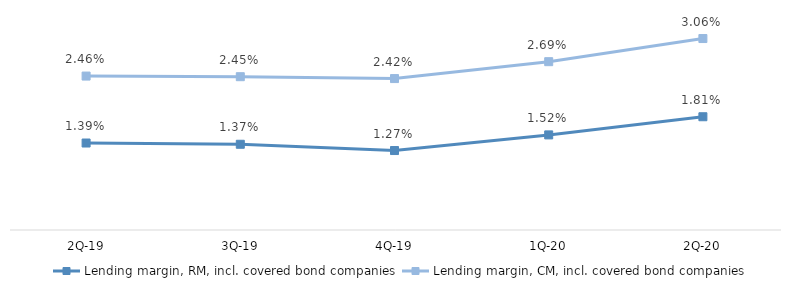
| Category | Lending margin, RM, incl. covered bond companies | Lending margin, CM, incl. covered bond companies |
|---|---|---|
| 2Q-20 | 0.018 | 0.031 |
| 1Q-20 | 0.015 | 0.027 |
| 4Q-19 | 0.013 | 0.024 |
| 3Q-19 | 0.014 | 0.024 |
| 2Q-19 | 0.014 | 0.025 |